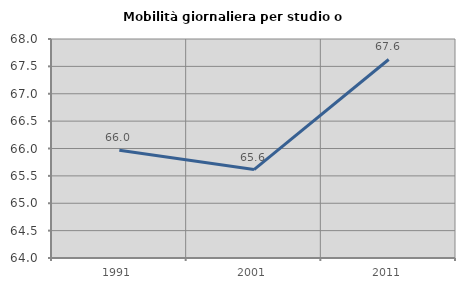
| Category | Mobilità giornaliera per studio o lavoro |
|---|---|
| 1991.0 | 65.969 |
| 2001.0 | 65.615 |
| 2011.0 | 67.626 |